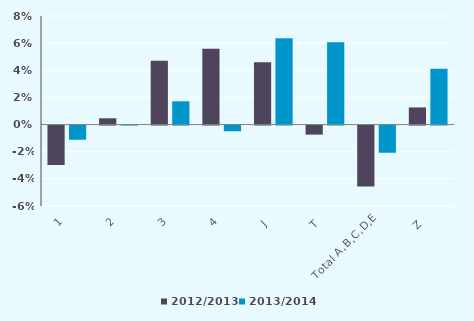
| Category | 2012/2013 | 2013/2014 |
|---|---|---|
| 1 | -0.029 | -0.01 |
| 2 | 0.005 | 0 |
| 3 | 0.047 | 0.017 |
| 4 | 0.056 | -0.004 |
| J  | 0.046 | 0.064 |
| T  | -0.007 | 0.061 |
| Total A,B,C,D,E | -0.045 | -0.02 |
| Z  | 0.013 | 0.041 |